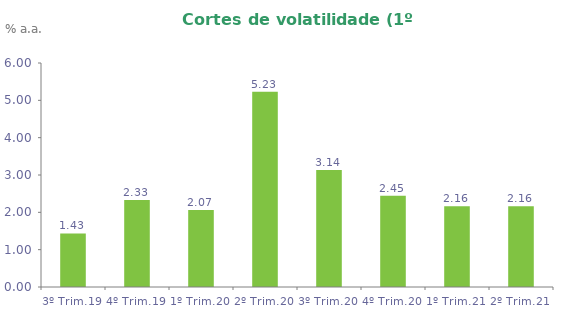
| Category | Series 0 |
|---|---|
| 3º Trim.19 | 1.435 |
| 4º Trim.19 | 2.33 |
| 1º Trim.20 | 2.065 |
| 2º Trim.20 | 5.231 |
| 3º Trim.20 | 3.137 |
| 4º Trim.20 | 2.447 |
| 1º Trim.21 | 2.162 |
| 2º Trim.21 | 2.162 |